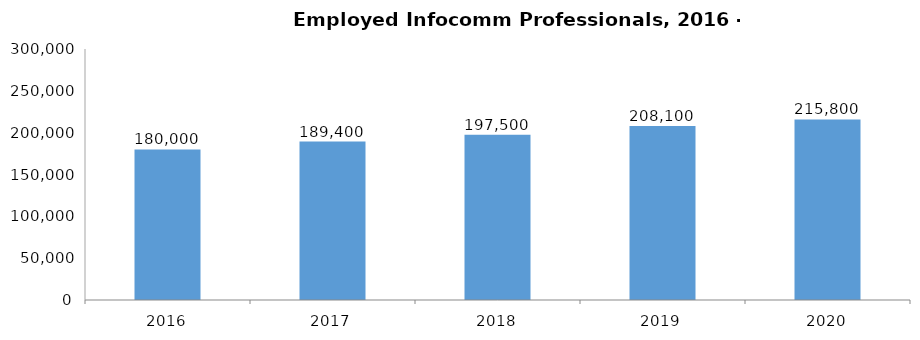
| Category | Employed Infocomm Professionals |
|---|---|
| 2016.0 | 180000 |
| 2017.0 | 189400 |
| 2018.0 | 197500 |
| 2019.0 | 208100 |
| 2020.0 | 215800 |